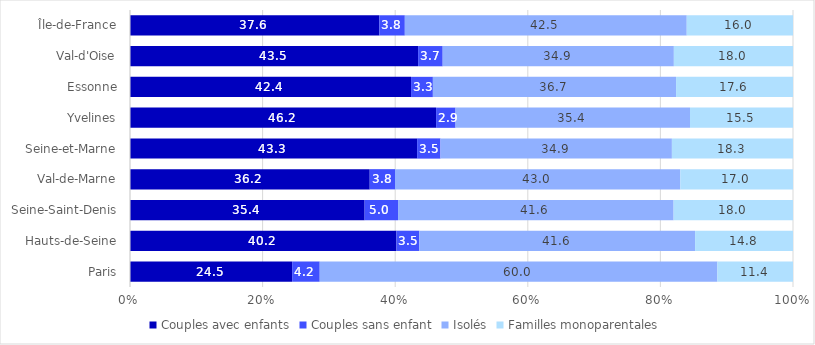
| Category | Couples avec enfants | Couples sans enfant | Isolés | Familles monoparentales |
|---|---|---|---|---|
| Paris | 24.458 | 4.158 | 59.983 | 11.402 |
| Hauts-de-Seine | 40.189 | 3.454 | 41.59 | 14.767 |
| Seine-Saint-Denis | 35.388 | 5.043 | 41.562 | 18.007 |
| Val-de-Marne | 36.157 | 3.813 | 43.036 | 16.994 |
| Seine-et-Marne | 43.305 | 3.525 | 34.904 | 18.266 |
| Yvelines | 46.169 | 2.932 | 35.365 | 15.534 |
| Essonne | 42.391 | 3.292 | 36.681 | 17.637 |
| Val-d'Oise | 43.455 | 3.708 | 34.866 | 17.97 |
| Île-de-France | 37.609 | 3.842 | 42.523 | 16.026 |